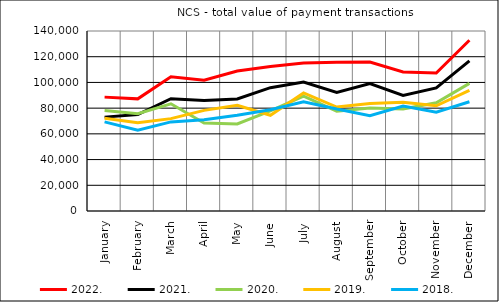
| Category | 2022. | 2021. | 2020. | 2019. | 2018. |
|---|---|---|---|---|---|
| January | 88568.211 | 73015.721 | 78223.611 | 72184.265 | 69351.764 |
| February | 87217.567 | 75068.685 | 75658.633 | 68627.262 | 62759.148 |
| March | 104391.478 | 87328.5 | 83413.752 | 71840.558 | 69289.864 |
| April | 101771.884 | 85958.633 | 68495.201 | 78264.843 | 70991.528 |
| May | 108894.499 | 87110.547 | 67690.304 | 82243.195 | 74413.682 |
| June | 112466.31 | 95904.61 | 77955.009 | 74431.908 | 78689.421 |
| July | 115031.606 | 100270.862 | 89295.612 | 91846.357 | 85004.852 |
| August | 115604.065 | 92233.302 | 77630.264 | 80865.567 | 79264.001 |
| September | 115819.51 | 99122.364 | 80127.998 | 83666.014 | 74134.007 |
| October | 108181.797 | 89941.214 | 79344.72 | 84569.96 | 81591.941 |
| November | 107340.074 | 95746.994 | 84122.458 | 81864.065 | 76800.959 |
| December | 132812.938 | 116809.723 | 99261.22 | 93867.932 | 84938.1 |